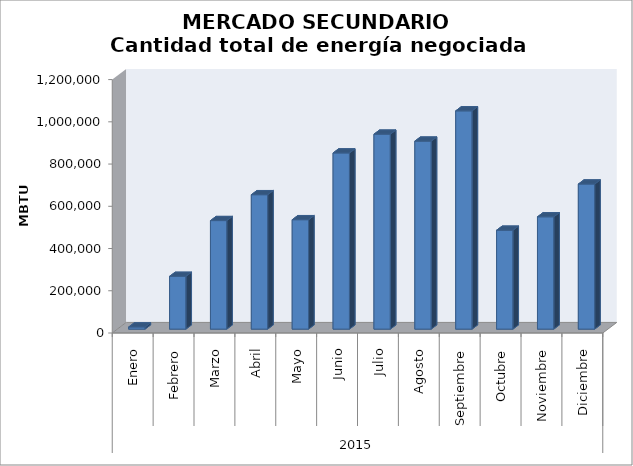
| Category | Cantidad Total
(MBTU) |
|---|---|
| 0 | 10142 |
| 1 | 249893 |
| 2 | 513910 |
| 3 | 636472 |
| 4 | 518044 |
| 5 | 834143 |
| 6 | 923054 |
| 7 | 890145 |
| 8 | 1033529 |
| 9 | 468265 |
| 10 | 531808 |
| 11 | 686923 |